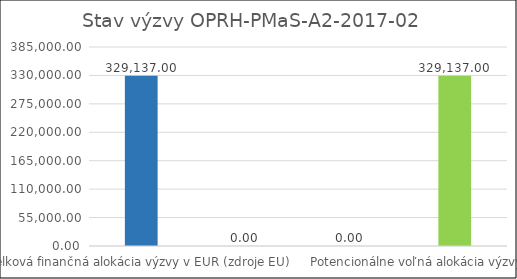
| Category | Stav výzvy OPRH-PMaS-A2-2017-02   |
|---|---|
| Celková finančná alokácia výzvy v EUR (zdroje EU) | 329137 |
| Suma žiadostí o NFP v konaní v EUR (zdroje EU) | 0 |
| Suma schválených žiadostí o NFP (zdroje EU) | 0 |
| Potencionálne voľná alokácia výzvy (zdroje EU) | 329137 |